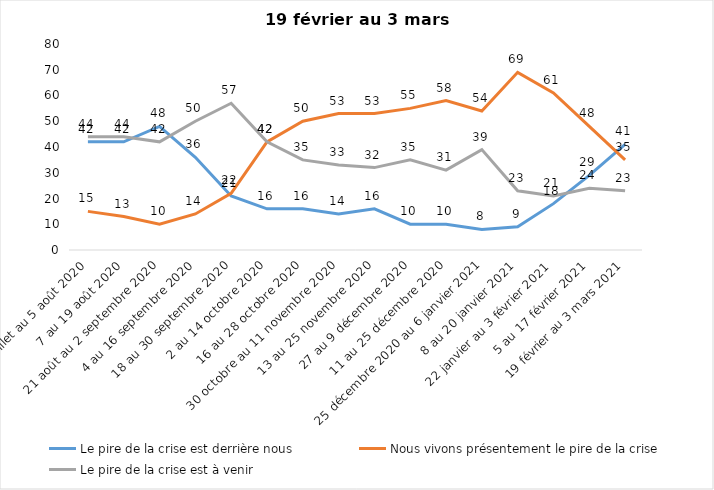
| Category | Le pire de la crise est derrière nous | Nous vivons présentement le pire de la crise | Le pire de la crise est à venir |
|---|---|---|---|
| 24 juillet au 5 août 2020 | 42 | 15 | 44 |
| 7 au 19 août 2020 | 42 | 13 | 44 |
| 21 août au 2 septembre 2020 | 48 | 10 | 42 |
| 4 au 16 septembre 2020 | 36 | 14 | 50 |
| 18 au 30 septembre 2020 | 21 | 22 | 57 |
| 2 au 14 octobre 2020 | 16 | 42 | 42 |
| 16 au 28 octobre 2020 | 16 | 50 | 35 |
| 30 octobre au 11 novembre 2020 | 14 | 53 | 33 |
| 13 au 25 novembre 2020 | 16 | 53 | 32 |
| 27 au 9 décembre 2020 | 10 | 55 | 35 |
| 11 au 25 décembre 2020 | 10 | 58 | 31 |
| 25 décembre 2020 au 6 janvier 2021 | 8 | 54 | 39 |
| 8 au 20 janvier 2021 | 9 | 69 | 23 |
| 22 janvier au 3 février 2021 | 18 | 61 | 21 |
| 5 au 17 février 2021 | 29 | 48 | 24 |
| 19 février au 3 mars 2021 | 41 | 35 | 23 |